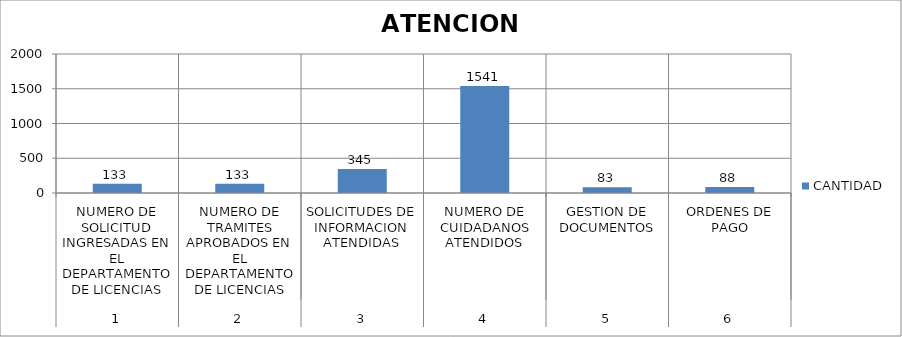
| Category | CANTIDAD |
|---|---|
| 0 | 133 |
| 1 | 133 |
| 2 | 345 |
| 3 | 1541 |
| 4 | 83 |
| 5 | 88 |